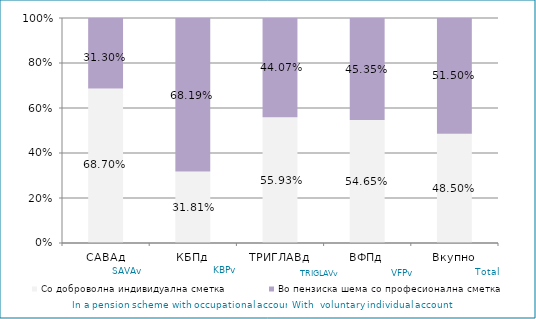
| Category | Со доброволна индивидуална сметка  | Во пензиска шема со професионална сметка |
|---|---|---|
| САВАд | 0.687 | 0.313 |
| КБПд | 0.318 | 0.682 |
| ТРИГЛАВд | 0.559 | 0.441 |
| ВФПд | 0.547 | 0.453 |
| Вкупно | 0.485 | 0.515 |